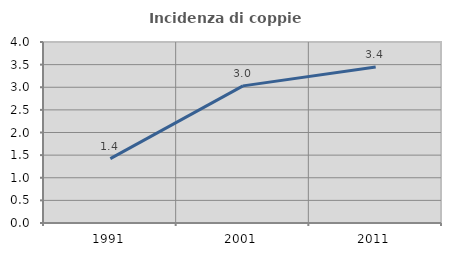
| Category | Incidenza di coppie miste |
|---|---|
| 1991.0 | 1.423 |
| 2001.0 | 3.03 |
| 2011.0 | 3.448 |